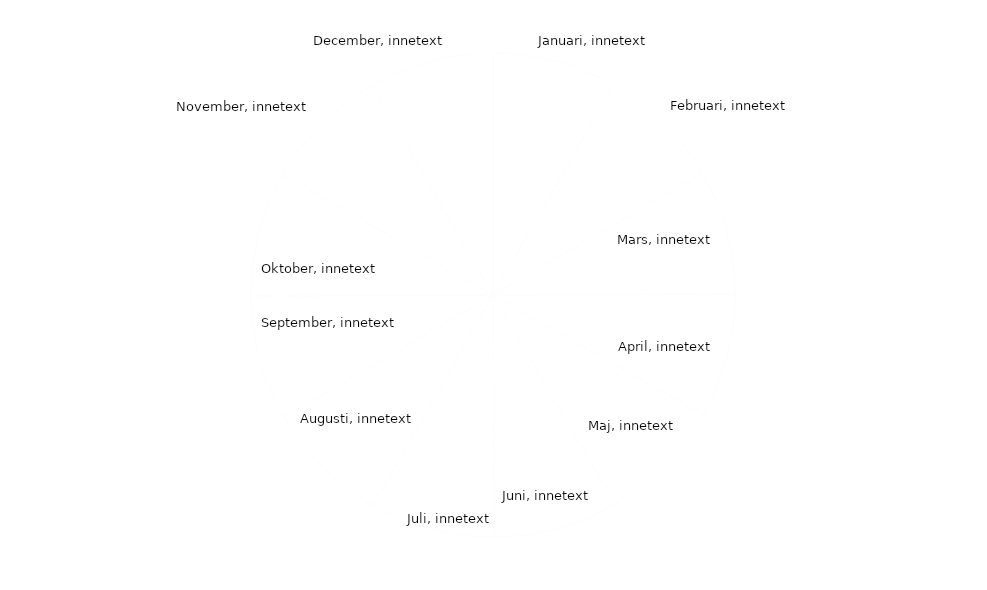
| Category | Period |
|---|---|
| 0 | 2024-01-01 |
| 1 | 2024-02-01 |
| 2 | 2024-03-01 |
| 3 | 2024-04-01 |
| 4 | 2024-05-01 |
| 5 | 2024-06-01 |
| 6 | 2024-07-01 |
| 7 | 2024-08-01 |
| 8 | 2024-09-01 |
| 9 | 2024-10-01 |
| 10 | 2024-11-01 |
| 11 | 2024-12-01 |